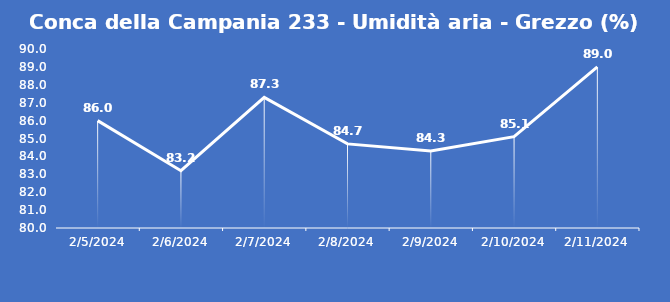
| Category | Conca della Campania 233 - Umidità aria - Grezzo (%) |
|---|---|
| 2/5/24 | 86 |
| 2/6/24 | 83.2 |
| 2/7/24 | 87.3 |
| 2/8/24 | 84.7 |
| 2/9/24 | 84.3 |
| 2/10/24 | 85.1 |
| 2/11/24 | 89 |